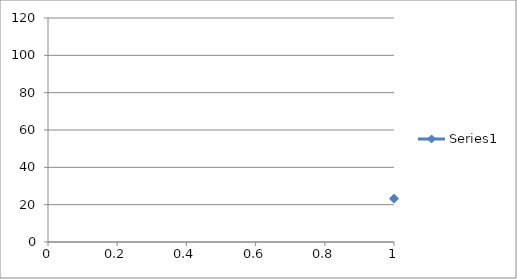
| Category | Series 0 |
|---|---|
| 0 | 23.2 |
| 1 | 40 |
| 2 | 88.7 |
| 3 | 97.3 |
| 4 | 76.9 |
| 5 | 54 |
| 6 | 45.9 |
| 7 | 60.8 |
| 8 | 78.8 |
| 9 | 80.1 |
| 10 | 70.5 |
| 11 | 56.6 |
| 12 | 58.7 |
| 13 | 68.2 |
| 14 | 73.6 |
| 15 | 71.8 |